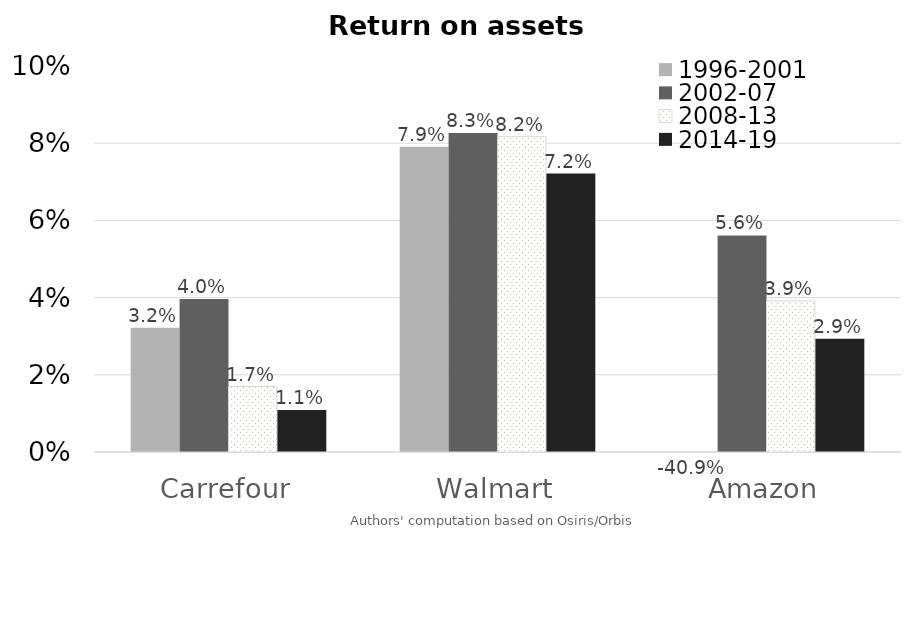
| Category | 1996-2001 | 2002-07 | 2008-13 | 2014-19 |
|---|---|---|---|---|
| Carrefour | 0.032 | 0.04 | 0.017 | 0.011 |
| Walmart | 0.079 | 0.083 | 0.082 | 0.072 |
| Amazon | -0.409 | 0.056 | 0.039 | 0.029 |